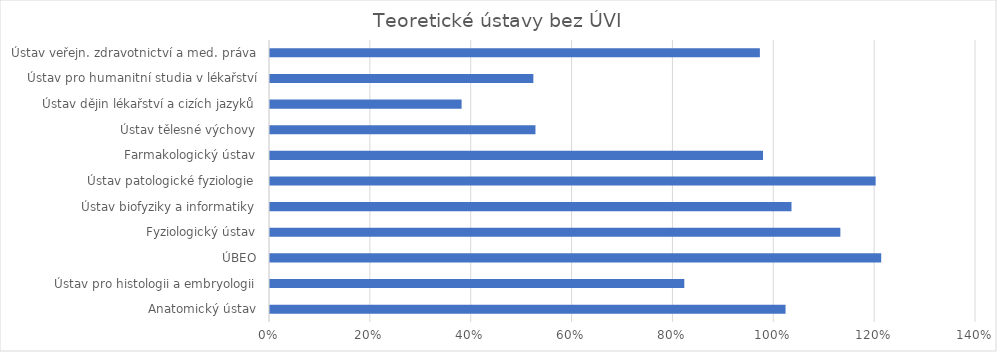
| Category | Series 0 |
|---|---|
| Anatomický ústav | 1.022 |
| Ústav pro histologii a embryologii | 0.822 |
| ÚBEO | 1.212 |
| Fyziologický ústav | 1.131 |
| Ústav biofyziky a informatiky | 1.034 |
| Ústav patologické fyziologie | 1.201 |
| Farmakologický ústav | 0.978 |
| Ústav tělesné výchovy | 0.526 |
| Ústav dějin lékařství a cizích jazyků | 0.38 |
| Ústav pro humanitní studia v lékařství | 0.522 |
| Ústav veřejn. zdravotnictví a med. práva | 0.971 |